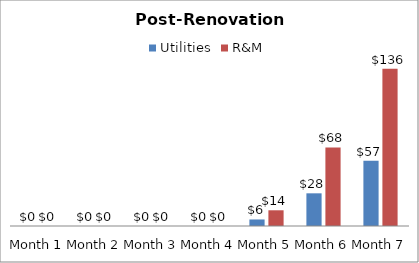
| Category | Utilities | R&M |
|---|---|---|
| 0 | 0 | 0 |
| 1 | 0 | 0 |
| 2 | 0 | 0 |
| 3 | 0 | 0 |
| 4 | 5.672 | 13.64 |
| 5 | 28.362 | 68.201 |
| 6 | 56.725 | 136.403 |